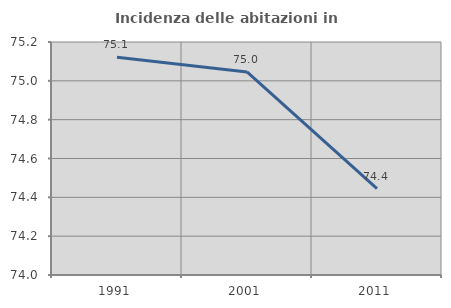
| Category | Incidenza delle abitazioni in proprietà  |
|---|---|
| 1991.0 | 75.121 |
| 2001.0 | 75.046 |
| 2011.0 | 74.444 |